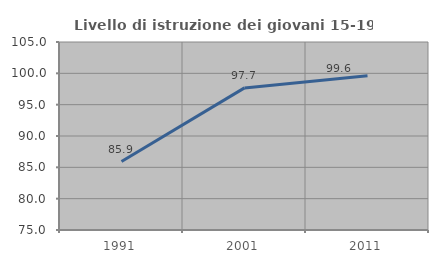
| Category | Livello di istruzione dei giovani 15-19 anni |
|---|---|
| 1991.0 | 85.918 |
| 2001.0 | 97.674 |
| 2011.0 | 99.632 |